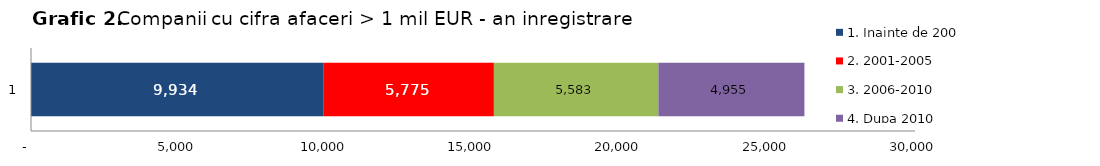
| Category | 1. Inainte de 2000 | 2. 2001-2005 | 3. 2006-2010 | 4. Dupa 2010 |
|---|---|---|---|---|
| 0 | 9934 | 5775 | 5583 | 4955 |